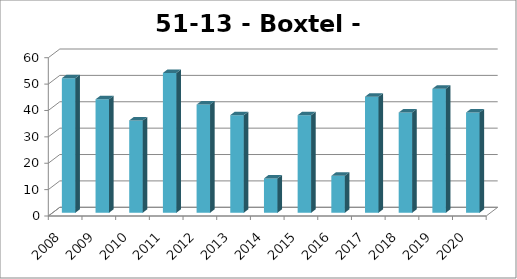
| Category | Boxtel - Lennisheuvel |
|---|---|
| 2008.0 | 51 |
| 2009.0 | 43 |
| 2010.0 | 35 |
| 2011.0 | 53 |
| 2012.0 | 41 |
| 2013.0 | 37 |
| 2014.0 | 13 |
| 2015.0 | 37 |
| 2016.0 | 14 |
| 2017.0 | 44 |
| 2018.0 | 38 |
| 2019.0 | 47 |
| 2020.0 | 38 |